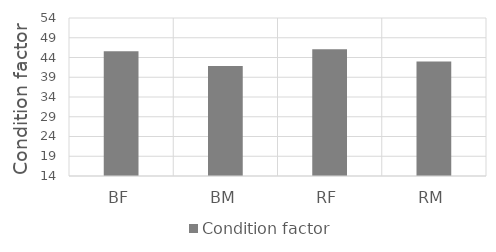
| Category | Condition factor |
|---|---|
| BF | 45.567 |
| BM | 41.88 |
| RF | 46.117 |
| RM | 42.992 |